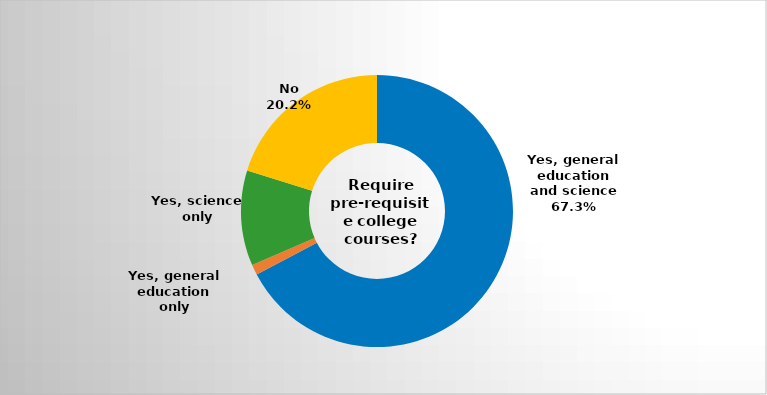
| Category | Series 0 |
|---|---|
| Yes, general education and science | 0.673 |
| Yes, general education only | 0.012 |
| Yes, science only | 0.113 |
| No | 0.202 |